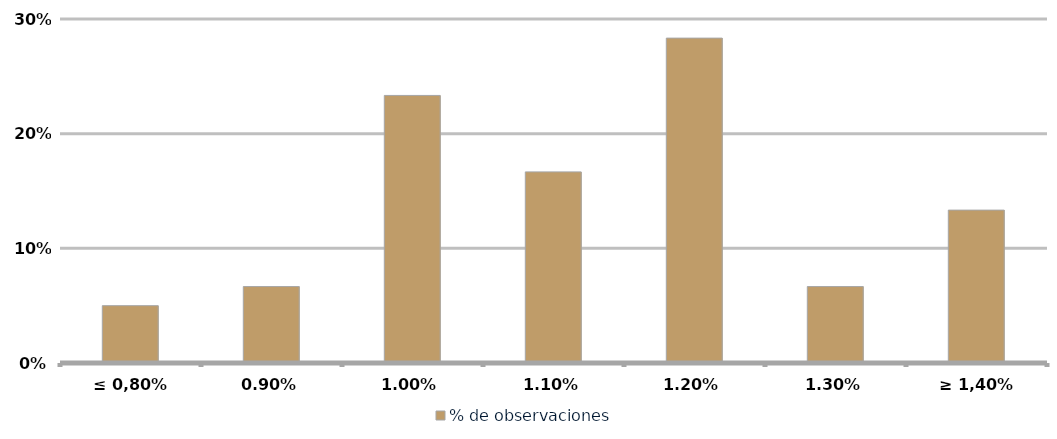
| Category | % de observaciones  |
|---|---|
| ≤ 0,80% | 0.05 |
| 0,90% | 0.067 |
| 1,00% | 0.233 |
| 1,10% | 0.167 |
| 1,20% | 0.283 |
| 1,30% | 0.067 |
| ≥ 1,40% | 0.133 |